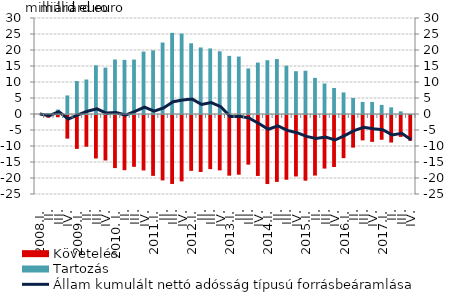
| Category | Követelés | Tartozás |
|---|---|---|
| 2008.I. | 0 | 0 |
| II. | -0.851 | 0.337 |
| III. | -0.698 | 1.39 |
| IV. | -7.383 | 5.802 |
| 2009.I. | -10.588 | 10.291 |
| II. | -9.918 | 10.776 |
| III. | -13.585 | 15.207 |
| IV. | -14.207 | 14.485 |
| 2010. I. | -16.589 | 17.029 |
| II. | -17.255 | 16.921 |
| III. | -16.201 | 17.019 |
| IV. | -17.327 | 19.493 |
| 2011.I. | -19.023 | 19.892 |
| II. | -20.434 | 22.342 |
| III. | -21.552 | 25.368 |
| IV. | -20.744 | 25.148 |
| 2012.I. | -17.452 | 22.1 |
| II. | -17.803 | 20.791 |
| III. | -16.919 | 20.478 |
| IV. | -17.305 | 19.594 |
| 2013.I. | -18.967 | 18.165 |
| II. | -18.657 | 17.945 |
| III. | -15.517 | 14.234 |
| IV. | -19.044 | 16.078 |
| 2014.I. | -21.576 | 16.806 |
| II. | -20.902 | 17.179 |
| III. | -20.231 | 15.101 |
| IV. | -19.214 | 13.372 |
| 2015.I. | -20.524 | 13.517 |
| II. | -18.928 | 11.298 |
| III. | -16.746 | 9.531 |
| IV. | -16.249 | 8.129 |
| 2016.I. | -13.479 | 6.745 |
| II. | -10.189 | 5.006 |
| III. | -7.934 | 3.767 |
| IV. | -8.398 | 3.778 |
| 2017.I. | -7.739 | 2.842 |
| II. | -8.601 | 2.073 |
| III. | -6.837 | 0.823 |
| IV. | -8.057 | 0.002 |